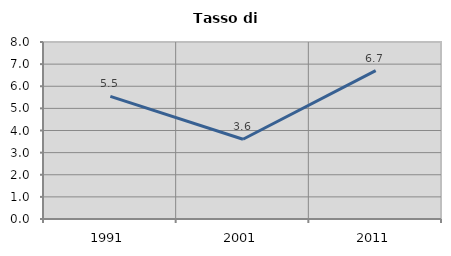
| Category | Tasso di disoccupazione   |
|---|---|
| 1991.0 | 5.542 |
| 2001.0 | 3.605 |
| 2011.0 | 6.703 |